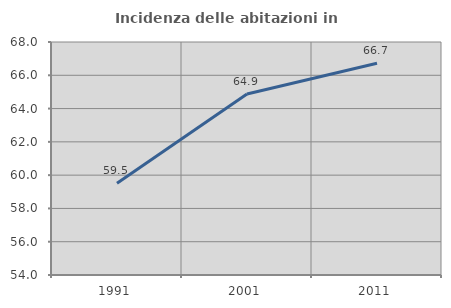
| Category | Incidenza delle abitazioni in proprietà  |
|---|---|
| 1991.0 | 59.508 |
| 2001.0 | 64.88 |
| 2011.0 | 66.724 |